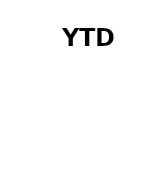
| Category | YTD |
|---|---|
| YTD | 0 |